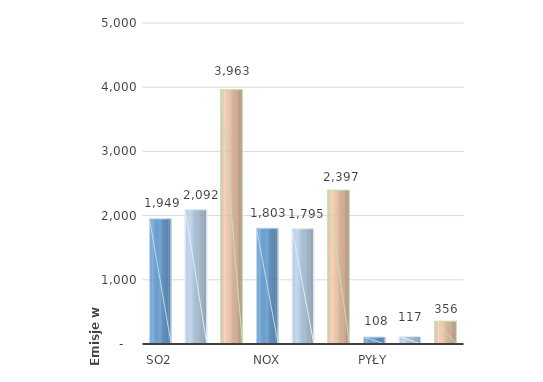
| Category | Series 0 |
|---|---|
| SO2 | 1949 |
|  | 2092 |
|  | 3962.77 |
| NOx | 1803 |
|  | 1795 |
|  | 2397.27 |
| Pyły | 108 |